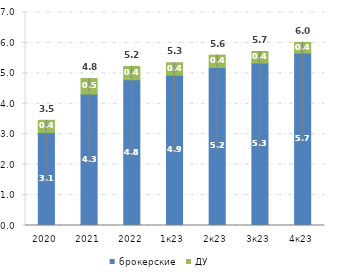
| Category | брокерские | ДУ |
|---|---|---|
| 2020 | 3.055 | 0.402 |
| 2021 | 4.316 | 0.513 |
| 2022 | 4.789 | 0.437 |
| 1к23 | 4.938 | 0.41 |
| 2к23 | 5.194 | 0.406 |
| 3к23 | 5.34 | 0.378 |
| 4к23 | 5.666 | 0.352 |